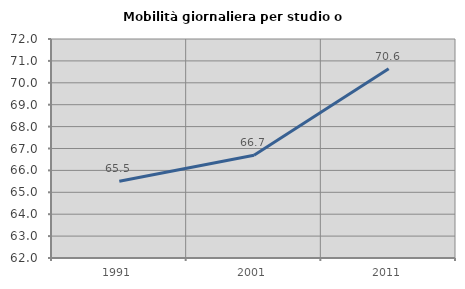
| Category | Mobilità giornaliera per studio o lavoro |
|---|---|
| 1991.0 | 65.504 |
| 2001.0 | 66.691 |
| 2011.0 | 70.645 |